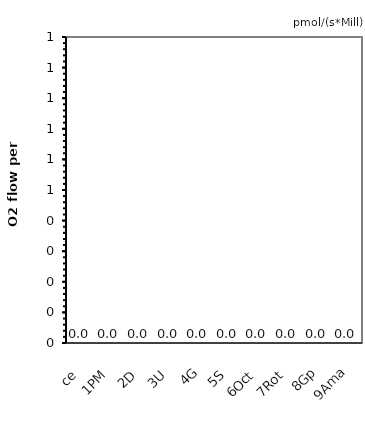
| Category | pmol/(s*Mill) |
|---|---|
| ce | 0 |
| 1PM | 0 |
| 2D | 0 |
| 3U | 0 |
| 4G | 0 |
| 5S | 0 |
| 6Oct | 0 |
| 7Rot | 0 |
| 8Gp | 0 |
| 9Ama | 0 |